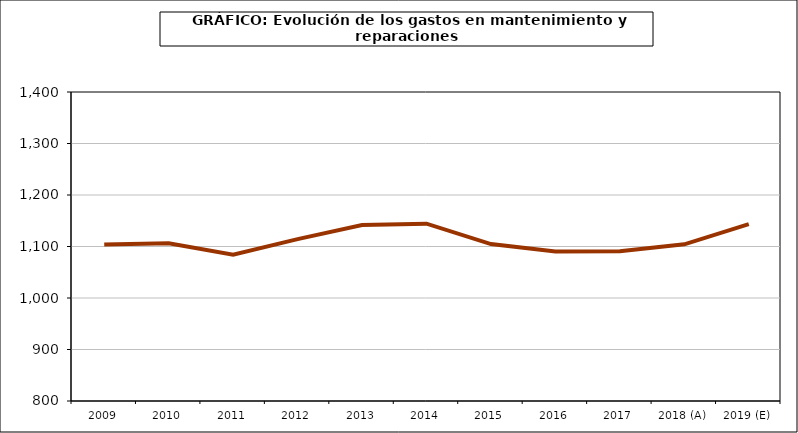
| Category | Series 0 |
|---|---|
| 2009 | 1103.67 |
| 2010 | 1106.325 |
| 2011 | 1083.98 |
| 2012 | 1114.377 |
| 2013 | 1141.575 |
| 2014 | 1144.341 |
| 2015 | 1104.719 |
| 2016 | 1090.39 |
| 2017 | 1090.889 |
| 2018 (A) | 1104.27 |
| 2019 (E) | 1143.365 |